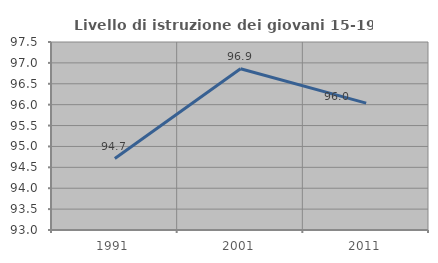
| Category | Livello di istruzione dei giovani 15-19 anni |
|---|---|
| 1991.0 | 94.71 |
| 2001.0 | 96.86 |
| 2011.0 | 96.038 |